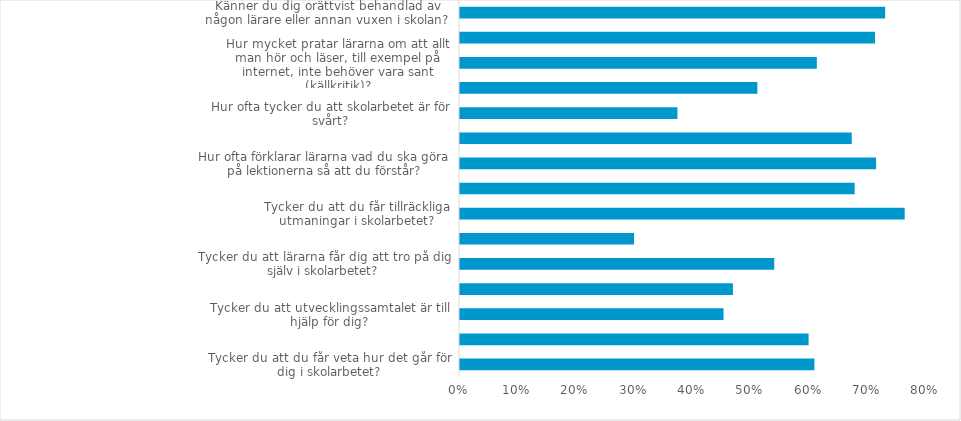
| Category | (Alla) |
|---|---|
| Tycker du att du får veta hur det går för dig i skolarbetet? | 0.607 |
| Tycker du att lärarna förklarar vad du behöver kunna i de olika ämnena? | 0.597 |
| Tycker du att utvecklingssamtalet är till hjälp för dig? | 0.451 |
| Tycker du att lärarna varierar lektionerna så att ni får arbeta på olika sätt? | 0.468 |
| Tycker du att lärarna får dig att tro på dig själv i skolarbetet? | 0.538 |
| Hur ofta får lärarna dig att bli intresserad av skolarbetet? | 0.298 |
| Tycker du att du får tillräckliga utmaningar i skolarbetet? | 0.762 |
| Hur ofta får du den hjälp du behöver under lektionerna? | 0.676 |
| Hur ofta förklarar lärarna vad du ska göra på lektionerna så att du förstår? | 0.713 |
| Tycker du att du får den hjälp du behöver från skolan för att klara skolarbetet | 0.671 |
| Hur ofta tycker du att skolarbetet är för svårt? | 0.373 |
| Hur mycket tycker du att ni elever får öva på att diskutera frågor där man kan tycka olika? | 0.509 |
| Hur mycket pratar lärarna om att allt man hör och läser, till exempel på internet, inte behöver vara sant (källkritik)? | 0.611 |
| Tycker du att lärarna behandlar alla elever lika oavsett om de är flickor, pojkar eller har annan könsidentitet? | 0.711 |
| Känner du dig orättvist behandlad av någon lärare eller annan vuxen i skolan? | 0.728 |